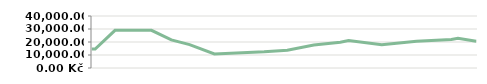
| Category | MĚSÍC   |
|---|---|
| 2013-04-23 | 14600 |
| 2013-04-25 | 14600 |
| 2013-05-07 | 29000 |
| 2013-05-14 | 29000 |
| 2013-05-14 | 29000 |
| 2013-05-29 | 29000 |
| 2013-06-10 | 21600 |
| 2013-06-21 | 17950 |
| 2013-07-06 | 10776.471 |
| 2013-08-05 | 12455.862 |
| 2013-08-19 | 13667.568 |
| 2013-09-04 | 17651.667 |
| 2013-09-20 | 19877.912 |
| 2013-09-25 | 21138.05 |
| 2013-10-15 | 17951.744 |
| 2013-11-05 | 20556.13 |
| 2013-11-26 | 21997.139 |
| 2013-11-30 | 22917.635 |
| 2013-12-11 | 20504.315 |